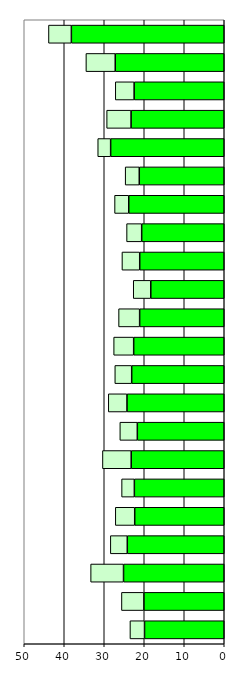
| Category | Series 0 | Series 1 |
|---|---|---|
| 0 | 19.93 | 3.644 |
| 1 | 20.083 | 5.619 |
| 2 | 25.18 | 8.225 |
| 3 | 24.239 | 4.242 |
| 4 | 22.383 | 4.853 |
| 5 | 22.476 | 3.186 |
| 6 | 23.263 | 7.186 |
| 7 | 21.734 | 4.366 |
| 8 | 24.32 | 4.671 |
| 9 | 23.138 | 4.22 |
| 10 | 22.642 | 5.007 |
| 11 | 21.15 | 5.267 |
| 12 | 18.365 | 4.386 |
| 13 | 21.132 | 4.444 |
| 14 | 20.642 | 3.776 |
| 15 | 23.872 | 3.55 |
| 16 | 21.244 | 3.524 |
| 17 | 28.401 | 3.224 |
| 18 | 23.298 | 6.102 |
| 19 | 22.534 | 4.706 |
| 20 | 27.252 | 7.333 |
| 21 | 38.222 | 5.722 |